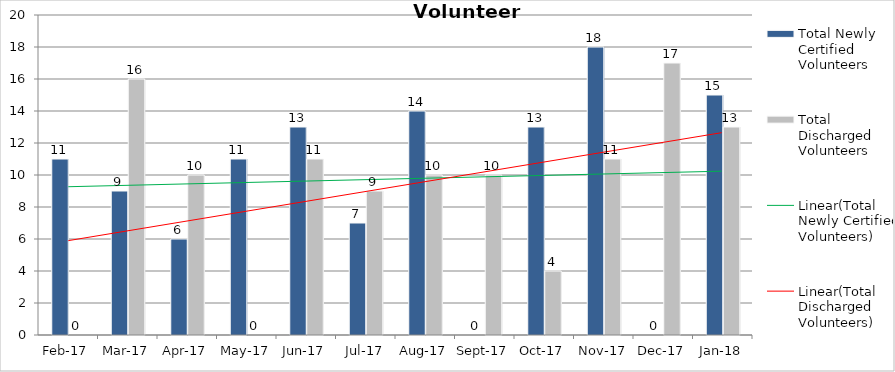
| Category | Total Newly Certified Volunteers | Total Discharged Volunteers |
|---|---|---|
| 2017-02-01 | 11 | 0 |
| 2017-03-01 | 9 | 16 |
| 2017-04-01 | 6 | 10 |
| 2017-05-01 | 11 | 0 |
| 2017-06-01 | 13 | 11 |
| 2017-07-01 | 7 | 9 |
| 2017-08-01 | 14 | 10 |
| 2017-09-01 | 0 | 10 |
| 2017-10-01 | 13 | 4 |
| 2017-11-01 | 18 | 11 |
| 2017-12-01 | 0 | 17 |
| 2018-01-01 | 15 | 13 |